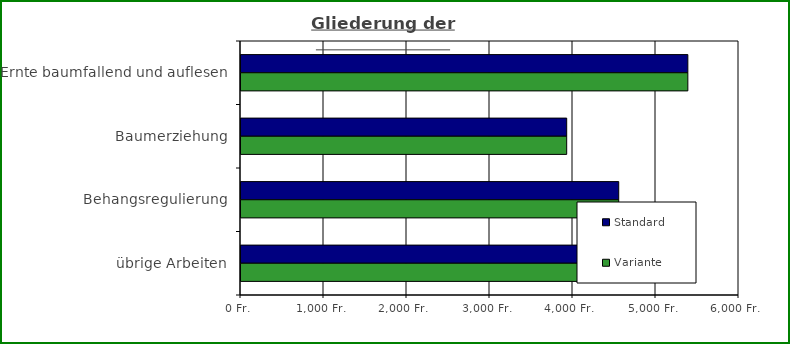
| Category | Standard | Variante  |
|---|---|---|
| Ernte baumfallend und auflesen | 5383.786 | 5383.786 |
| Baumerziehung | 3924 | 3924 |
| Behangsregulierung | 4551 | 4551 |
| übrige Arbeiten | 4710.075 | 4710.075 |